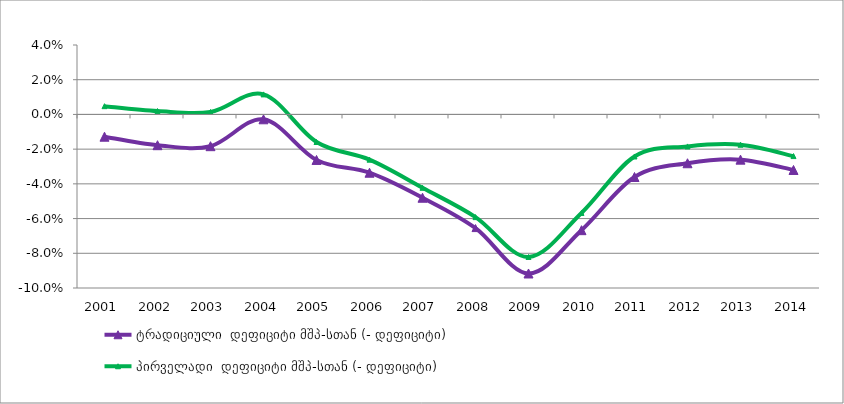
| Category | ტრადიციული  დეფიციტი მშპ-სთან (- დეფიციტი) |
|---|---|
| 2001.0 | -0.013 |
| 2002.0 | -0.018 |
| 2003.0 | -0.018 |
| 2004.0 | -0.003 |
| 2005.0 | -0.026 |
| 2006.0 | -0.034 |
| 2007.0 | -0.048 |
| 2008.0 | -0.065 |
| 2009.0 | -0.092 |
| 2010.0 | -0.067 |
| 2011.0 | -0.036 |
| 2012.0 | -0.028 |
| 2013.0 | -0.026 |
| 2014.0 | -0.032 |